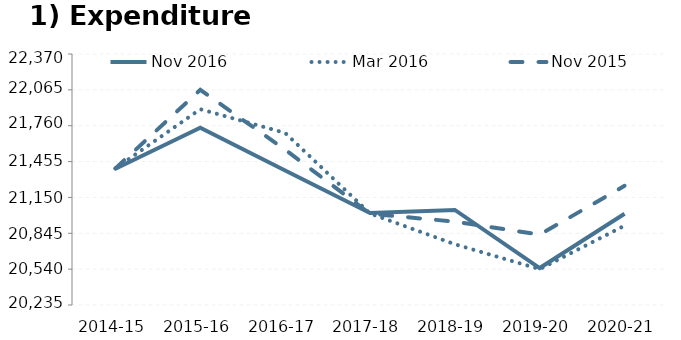
| Category | Nov 2016 | Mar 2016 | Nov 2015 |
|---|---|---|---|
| 2014-15 | 0.56 | 0.562 | 0.562 |
| 2015-16 | 0.789 | 0.892 | 1 |
| 2016-17 | 0.55 | 0.76 | 0.666 |
| 2017-18 | 0.313 | 0.31 | 0.309 |
| 2018-19 | 0.33 | 0.139 | 0.265 |
| 2019-20 | 0.006 | 0 | 0.192 |
| 2020-21 | 0.309 | 0.243 | 0.465 |